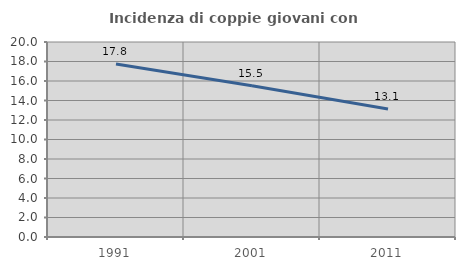
| Category | Incidenza di coppie giovani con figli |
|---|---|
| 1991.0 | 17.751 |
| 2001.0 | 15.508 |
| 2011.0 | 13.122 |